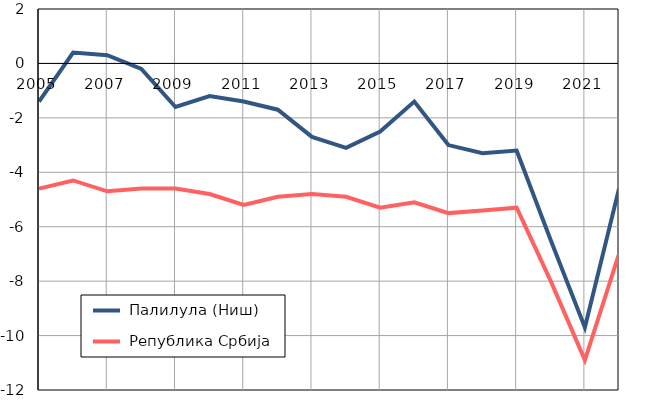
| Category |  Палилула (Ниш) |  Република Србија |
|---|---|---|
| 2005.0 | -1.4 | -4.6 |
| 2006.0 | 0.4 | -4.3 |
| 2007.0 | 0.3 | -4.7 |
| 2008.0 | -0.2 | -4.6 |
| 2009.0 | -1.6 | -4.6 |
| 2010.0 | -1.2 | -4.8 |
| 2011.0 | -1.4 | -5.2 |
| 2012.0 | -1.7 | -4.9 |
| 2013.0 | -2.7 | -4.8 |
| 2014.0 | -3.1 | -4.9 |
| 2015.0 | -2.5 | -5.3 |
| 2016.0 | -1.4 | -5.1 |
| 2017.0 | -3 | -5.5 |
| 2018.0 | -3.3 | -5.4 |
| 2019.0 | -3.2 | -5.3 |
| 2020.0 | -6.5 | -8 |
| 2021.0 | -9.7 | -10.9 |
| 2022.0 | -4.6 | -7 |